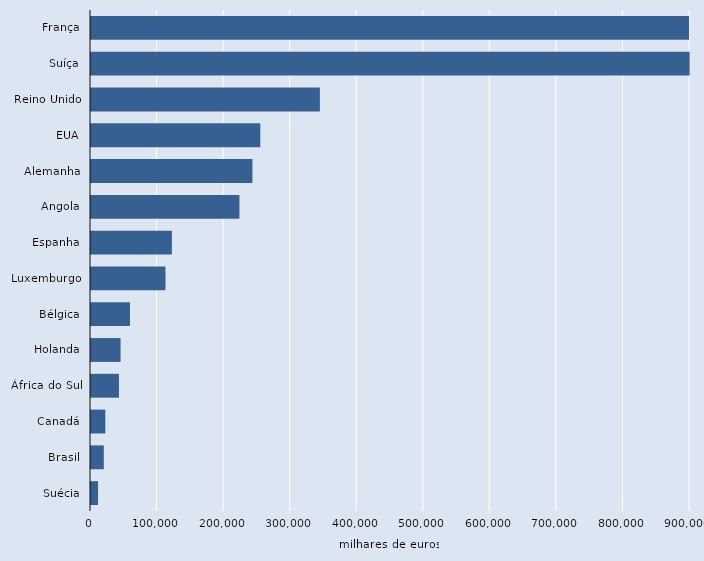
| Category | Series 2 |
|---|---|
| França | 1133290 |
| Suíça | 899460 |
| Reino Unido | 343900 |
| EUA | 254350 |
| Alemanha | 242520 |
| Angola | 223010 |
| Espanha | 121520 |
| Luxemburgo | 111910 |
| Bélgica | 58580 |
| Holanda | 44430 |
| África do Sul | 42000 |
| Canadá | 21510 |
| Brasil | 19220 |
| Suécia | 10570 |